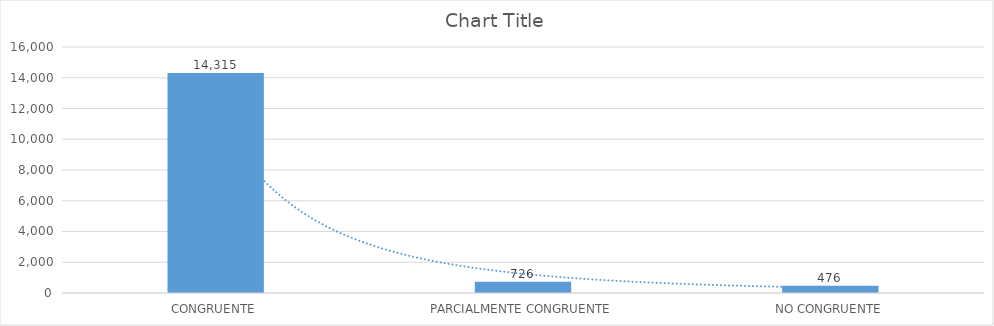
| Category | Series 0 |
|---|---|
| CONGRUENTE | 14315 |
| PARCIALMENTE CONGRUENTE | 726 |
| NO CONGRUENTE | 476 |